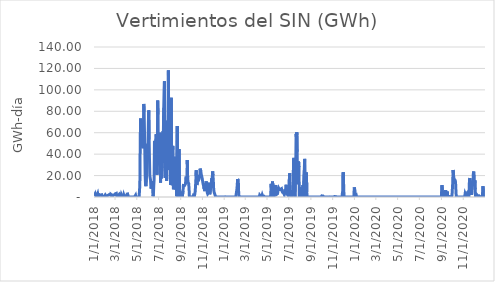
| Category | Vertimientos del SIN (GWh) |
|---|---|
| 1/1/18 | 1.13 |
| 1/2/18 | 1.378 |
| 1/3/18 | 1.344 |
| 1/4/18 | 3.189 |
| 1/5/18 | 3.084 |
| 1/6/18 | 1.109 |
| 1/7/18 | 1.927 |
| 1/8/18 | 1.603 |
| 1/9/18 | 1.216 |
| 1/10/18 | 0.999 |
| 1/11/18 | 3.016 |
| 1/12/18 | 1.271 |
| 1/13/18 | 1.168 |
| 1/14/18 | 2.095 |
| 1/15/18 | 0.832 |
| 1/16/18 | 2.172 |
| 1/17/18 | 2.599 |
| 1/18/18 | 1.788 |
| 1/19/18 | 1.779 |
| 1/20/18 | 1.538 |
| 1/21/18 | 0.948 |
| 1/22/18 | 2.077 |
| 1/23/18 | 0.926 |
| 1/24/18 | 0.16 |
| 1/25/18 | 0.067 |
| 1/26/18 | 0.034 |
| 1/27/18 | 0.506 |
| 1/28/18 | 0.187 |
| 1/29/18 | 0.585 |
| 1/30/18 | 1.235 |
| 1/31/18 | 1.028 |
| 2/1/18 | 1.982 |
| 2/2/18 | 1.625 |
| 2/3/18 | 0.869 |
| 2/4/18 | 0.114 |
| 2/5/18 | 0.027 |
| 2/6/18 | 1.088 |
| 2/7/18 | 1.088 |
| 2/8/18 | 1.008 |
| 2/9/18 | 1.652 |
| 2/10/18 | 1.34 |
| 2/11/18 | 1.743 |
| 2/12/18 | 2.206 |
| 2/13/18 | 2.71 |
| 2/14/18 | 1.597 |
| 2/15/18 | 1.786 |
| 2/16/18 | 2.73 |
| 2/17/18 | 2.939 |
| 2/18/18 | 2.361 |
| 2/19/18 | 1.885 |
| 2/20/18 | 1.237 |
| 2/21/18 | 1.271 |
| 2/22/18 | 0.869 |
| 2/23/18 | 0.67 |
| 2/24/18 | 1.959 |
| 2/25/18 | 2.119 |
| 2/26/18 | 2.29 |
| 2/27/18 | 2.001 |
| 2/28/18 | 2.127 |
| 3/1/18 | 2.964 |
| 3/2/18 | 2.808 |
| 3/3/18 | 3.043 |
| 3/4/18 | 3.418 |
| 3/5/18 | 1.757 |
| 3/6/18 | 0.362 |
| 3/7/18 | 0.404 |
| 3/8/18 | 1.287 |
| 3/9/18 | 1.099 |
| 3/10/18 | 0.787 |
| 3/11/18 | 1.512 |
| 3/12/18 | 2.406 |
| 3/13/18 | 1.493 |
| 3/14/18 | 0.835 |
| 3/15/18 | 0.569 |
| 3/16/18 | 0.784 |
| 3/17/18 | 0.842 |
| 3/18/18 | 2.352 |
| 3/19/18 | 2.52 |
| 3/20/18 | 0.835 |
| 3/21/18 | 0.893 |
| 3/22/18 | 1.529 |
| 3/23/18 | 1.485 |
| 3/24/18 | 0.261 |
| 3/25/18 | 1.938 |
| 3/26/18 | 1.082 |
| 3/27/18 | 0.031 |
| 3/28/18 | 0.208 |
| 3/29/18 | 1.074 |
| 3/30/18 | 2.277 |
| 3/31/18 | 0.946 |
| 4/1/18 | 1.582 |
| 4/2/18 | 0.538 |
| 4/3/18 | 0 |
| 4/4/18 | 3.951 |
| 4/5/18 | 3.057 |
| 4/6/18 | 0 |
| 4/7/18 | 0 |
| 4/8/18 | 0 |
| 4/9/18 | 0 |
| 4/10/18 | 0 |
| 4/11/18 | 0 |
| 4/12/18 | 0 |
| 4/13/18 | 0 |
| 4/14/18 | 0 |
| 4/15/18 | 0 |
| 4/16/18 | 0 |
| 4/17/18 | 0 |
| 4/18/18 | 0 |
| 4/19/18 | 0 |
| 4/20/18 | 0 |
| 4/21/18 | 0 |
| 4/22/18 | 0 |
| 4/23/18 | 0 |
| 4/24/18 | 0 |
| 4/25/18 | 0 |
| 4/26/18 | 0 |
| 4/27/18 | 1.664 |
| 4/28/18 | 0.016 |
| 4/29/18 | 0 |
| 4/30/18 | 0 |
| 5/1/18 | 0 |
| 5/2/18 | 0.013 |
| 5/3/18 | 0 |
| 5/4/18 | 0 |
| 5/5/18 | 0 |
| 5/6/18 | 0 |
| 5/7/18 | 0 |
| 5/8/18 | 0 |
| 5/9/18 | 11.345 |
| 5/10/18 | 47.714 |
| 5/11/18 | 73.344 |
| 5/12/18 | 55.013 |
| 5/13/18 | 47.196 |
| 5/14/18 | 46.907 |
| 5/15/18 | 54.562 |
| 5/16/18 | 66.563 |
| 5/17/18 | 54.569 |
| 5/18/18 | 45.534 |
| 5/19/18 | 65.001 |
| 5/20/18 | 86.863 |
| 5/21/18 | 79.586 |
| 5/22/18 | 62.147 |
| 5/23/18 | 42.409 |
| 5/24/18 | 19.441 |
| 5/25/18 | 11.247 |
| 5/26/18 | 10.089 |
| 5/27/18 | 10.82 |
| 5/28/18 | 22.261 |
| 5/29/18 | 37.833 |
| 5/30/18 | 48.49 |
| 5/31/18 | 48.189 |
| 6/1/18 | 50.542 |
| 6/2/18 | 70.384 |
| 6/3/18 | 80.857 |
| 6/4/18 | 53.636 |
| 6/5/18 | 36.119 |
| 6/6/18 | 19.766 |
| 6/7/18 | 20.371 |
| 6/8/18 | 15.695 |
| 6/9/18 | 9.11 |
| 6/10/18 | 7.912 |
| 6/11/18 | 8.103 |
| 6/12/18 | 14.917 |
| 6/13/18 | 12.398 |
| 6/14/18 | 6.752 |
| 6/15/18 | 0.613 |
| 6/16/18 | 1.887 |
| 6/17/18 | 10.53 |
| 6/18/18 | 16.359 |
| 6/19/18 | 52.508 |
| 6/20/18 | 51.498 |
| 6/21/18 | 32.649 |
| 6/22/18 | 47.881 |
| 6/23/18 | 46.274 |
| 6/24/18 | 58.596 |
| 6/25/18 | 58.2 |
| 6/26/18 | 20.866 |
| 6/27/18 | 37.448 |
| 6/28/18 | 90.042 |
| 6/29/18 | 76.919 |
| 6/30/18 | 32.426 |
| 7/1/18 | 37.192 |
| 7/2/18 | 30.074 |
| 7/3/18 | 32.17 |
| 7/4/18 | 29.863 |
| 7/5/18 | 59.894 |
| 7/6/18 | 13.638 |
| 7/7/18 | 58.239 |
| 7/8/18 | 17.409 |
| 7/9/18 | 23.058 |
| 7/10/18 | 38.707 |
| 7/11/18 | 44.361 |
| 7/12/18 | 31.779 |
| 7/13/18 | 61.428 |
| 7/14/18 | 60.366 |
| 7/15/18 | 83.356 |
| 7/16/18 | 99.757 |
| 7/17/18 | 107.99 |
| 7/18/18 | 27.137 |
| 7/19/18 | 17.843 |
| 7/20/18 | 36.11 |
| 7/21/18 | 48.781 |
| 7/22/18 | 36.204 |
| 7/23/18 | 15.194 |
| 7/24/18 | 71.061 |
| 7/25/18 | 25.46 |
| 7/26/18 | 26.656 |
| 7/27/18 | 56.915 |
| 7/28/18 | 118.183 |
| 7/29/18 | 54.704 |
| 7/30/18 | 32.196 |
| 7/31/18 | 29.416 |
| 8/1/18 | 31.198 |
| 8/2/18 | 25.109 |
| 8/3/18 | 11.156 |
| 8/4/18 | 12.38 |
| 8/5/18 | 92.545 |
| 8/6/18 | 22.423 |
| 8/7/18 | 24.823 |
| 8/8/18 | 21.728 |
| 8/9/18 | 47.682 |
| 8/10/18 | 43.963 |
| 8/11/18 | 7.137 |
| 8/12/18 | 11.088 |
| 8/13/18 | 21.677 |
| 8/14/18 | 37.651 |
| 8/15/18 | 37.523 |
| 8/16/18 | 7.38 |
| 8/17/18 | 19.464 |
| 8/18/18 | 31.805 |
| 8/19/18 | 23.89 |
| 8/20/18 | 0.691 |
| 8/21/18 | 0 |
| 8/22/18 | 66.348 |
| 8/23/18 | 14.642 |
| 8/24/18 | 0 |
| 8/25/18 | 3.802 |
| 8/26/18 | 4.183 |
| 8/27/18 | 44.679 |
| 8/28/18 | 7.275 |
| 8/29/18 | 0 |
| 8/30/18 | 0.249 |
| 8/31/18 | 1.905 |
| 9/1/18 | 0.875 |
| 9/2/18 | 1.799 |
| 9/3/18 | 2.384 |
| 9/4/18 | 3.048 |
| 9/5/18 | 0.126 |
| 9/6/18 | 0.985 |
| 9/7/18 | 5.502 |
| 9/8/18 | 10.743 |
| 9/9/18 | 10.808 |
| 9/10/18 | 10.234 |
| 9/11/18 | 10.569 |
| 9/12/18 | 11.312 |
| 9/13/18 | 10.351 |
| 9/14/18 | 12.313 |
| 9/15/18 | 17.996 |
| 9/16/18 | 17.278 |
| 9/17/18 | 17.117 |
| 9/18/18 | 18.101 |
| 9/19/18 | 34.513 |
| 9/20/18 | 18.905 |
| 9/21/18 | 13.642 |
| 9/22/18 | 13.021 |
| 9/23/18 | 12.629 |
| 9/24/18 | 6.981 |
| 9/25/18 | 0 |
| 9/26/18 | 0 |
| 9/27/18 | 0 |
| 9/28/18 | 0 |
| 9/29/18 | 0 |
| 9/30/18 | 0 |
| 10/1/18 | 0 |
| 10/2/18 | 0 |
| 10/3/18 | 0 |
| 10/4/18 | 0 |
| 10/5/18 | 0.251 |
| 10/6/18 | 1.532 |
| 10/7/18 | 0.853 |
| 10/8/18 | 0.858 |
| 10/9/18 | 0.777 |
| 10/10/18 | 0.538 |
| 10/11/18 | 4.81 |
| 10/12/18 | 9.451 |
| 10/13/18 | 15.579 |
| 10/14/18 | 24.971 |
| 10/15/18 | 13.981 |
| 10/16/18 | 11.19 |
| 10/17/18 | 11.75 |
| 10/18/18 | 11.306 |
| 10/19/18 | 18.306 |
| 10/20/18 | 17.913 |
| 10/21/18 | 17.585 |
| 10/22/18 | 17.012 |
| 10/23/18 | 17.415 |
| 10/24/18 | 19.076 |
| 10/25/18 | 26.485 |
| 10/26/18 | 25.879 |
| 10/27/18 | 23.935 |
| 10/28/18 | 21.285 |
| 10/29/18 | 20.487 |
| 10/30/18 | 18.573 |
| 10/31/18 | 16.778 |
| 11/1/18 | 16.037 |
| 11/2/18 | 12.679 |
| 11/3/18 | 13.084 |
| 11/4/18 | 9.648 |
| 11/5/18 | 7.453 |
| 11/6/18 | 9.239 |
| 11/7/18 | 5.482 |
| 11/8/18 | 5.76 |
| 11/9/18 | 5.344 |
| 11/10/18 | 12.852 |
| 11/11/18 | 14.563 |
| 11/12/18 | 14.301 |
| 11/13/18 | 10.734 |
| 11/14/18 | 3.94 |
| 11/15/18 | 2.961 |
| 11/16/18 | 2.59 |
| 11/17/18 | 4.092 |
| 11/18/18 | 12.015 |
| 11/19/18 | 13.322 |
| 11/20/18 | 9.498 |
| 11/21/18 | 2.529 |
| 11/22/18 | 3.05 |
| 11/23/18 | 7.206 |
| 11/24/18 | 7.331 |
| 11/25/18 | 10.421 |
| 11/26/18 | 17.328 |
| 11/27/18 | 11.017 |
| 11/28/18 | 17.397 |
| 11/29/18 | 23.912 |
| 11/30/18 | 20.293 |
| 12/1/18 | 15.094 |
| 12/2/18 | 6.906 |
| 12/3/18 | 4.914 |
| 12/4/18 | 3.543 |
| 12/5/18 | 2.782 |
| 12/6/18 | 1.768 |
| 12/7/18 | 0.645 |
| 12/8/18 | 0.332 |
| 12/9/18 | 0.204 |
| 12/10/18 | 0.031 |
| 12/11/18 | 0 |
| 12/12/18 | 0 |
| 12/13/18 | 0 |
| 12/14/18 | 0 |
| 12/15/18 | 0 |
| 12/16/18 | 0 |
| 12/17/18 | 0 |
| 12/18/18 | 0 |
| 12/19/18 | 0 |
| 12/20/18 | 0 |
| 12/21/18 | 0 |
| 12/22/18 | 0 |
| 12/23/18 | 0 |
| 12/24/18 | 0 |
| 12/25/18 | 0 |
| 12/26/18 | 0 |
| 12/27/18 | 0 |
| 12/28/18 | 0 |
| 12/29/18 | 0 |
| 12/30/18 | 0 |
| 12/31/18 | 0 |
| 1/1/19 | 0 |
| 1/2/19 | 0 |
| 1/3/19 | 0.163 |
| 1/4/19 | 0 |
| 1/5/19 | 0 |
| 1/6/19 | 0 |
| 1/7/19 | 0 |
| 1/8/19 | 0 |
| 1/9/19 | 0 |
| 1/10/19 | 0 |
| 1/11/19 | 0 |
| 1/12/19 | 0 |
| 1/13/19 | 0 |
| 1/14/19 | 0 |
| 1/15/19 | 0 |
| 1/16/19 | 0 |
| 1/17/19 | 0 |
| 1/18/19 | 0 |
| 1/19/19 | 0 |
| 1/20/19 | 0 |
| 1/21/19 | 0 |
| 1/22/19 | 0 |
| 1/23/19 | 0 |
| 1/24/19 | 0 |
| 1/25/19 | 0 |
| 1/26/19 | 0 |
| 1/27/19 | 0 |
| 1/28/19 | 0 |
| 1/29/19 | 0 |
| 1/30/19 | 0 |
| 1/31/19 | 0 |
| 2/1/19 | 0 |
| 2/2/19 | 0 |
| 2/3/19 | 0 |
| 2/4/19 | 0 |
| 2/5/19 | 7.145 |
| 2/6/19 | 10.8 |
| 2/7/19 | 16.76 |
| 2/8/19 | 17.586 |
| 2/9/19 | 15.396 |
| 2/10/19 | 4.379 |
| 2/11/19 | 0 |
| 2/12/19 | 0 |
| 2/13/19 | 0 |
| 2/14/19 | 0 |
| 2/15/19 | 0 |
| 2/16/19 | 0 |
| 2/17/19 | 0 |
| 2/18/19 | 0 |
| 2/19/19 | 0 |
| 2/20/19 | 0 |
| 2/21/19 | 0 |
| 2/22/19 | 0 |
| 2/23/19 | 0 |
| 2/24/19 | 0 |
| 2/25/19 | 0 |
| 2/26/19 | 0 |
| 2/27/19 | 0 |
| 2/28/19 | 0 |
| 3/1/19 | 0 |
| 3/2/19 | 0 |
| 3/3/19 | 0 |
| 3/4/19 | 0 |
| 3/5/19 | 0 |
| 3/6/19 | 0 |
| 3/7/19 | 0 |
| 3/8/19 | 0 |
| 3/9/19 | 0 |
| 3/10/19 | 0 |
| 3/11/19 | 0 |
| 3/12/19 | 0 |
| 3/13/19 | 0 |
| 3/14/19 | 0 |
| 3/15/19 | 0 |
| 3/16/19 | 0 |
| 3/17/19 | 0 |
| 3/18/19 | 0 |
| 3/19/19 | 0 |
| 3/20/19 | 0 |
| 3/21/19 | 0 |
| 3/22/19 | 0 |
| 3/23/19 | 0 |
| 3/24/19 | 0 |
| 3/25/19 | 0 |
| 3/26/19 | 0 |
| 3/27/19 | 0 |
| 3/28/19 | 0 |
| 3/29/19 | 0 |
| 3/30/19 | 0 |
| 3/31/19 | 0 |
| 4/1/19 | 0 |
| 4/2/19 | 0 |
| 4/3/19 | 0 |
| 4/4/19 | 0 |
| 4/5/19 | 0 |
| 4/6/19 | 0 |
| 4/7/19 | 0 |
| 4/8/19 | 0 |
| 4/9/19 | 0.447 |
| 4/10/19 | 1.83 |
| 4/11/19 | 1.23 |
| 4/12/19 | 0.955 |
| 4/13/19 | 0.595 |
| 4/14/19 | 0.479 |
| 4/15/19 | 0.897 |
| 4/16/19 | 0.868 |
| 4/17/19 | 1.957 |
| 4/18/19 | 1.005 |
| 4/19/19 | 0.007 |
| 4/20/19 | 0 |
| 4/21/19 | 0.365 |
| 4/22/19 | 0.7 |
| 4/23/19 | 0.006 |
| 4/24/19 | 0 |
| 4/25/19 | 0 |
| 4/26/19 | 0 |
| 4/27/19 | 0 |
| 4/28/19 | 0 |
| 4/29/19 | 0 |
| 4/30/19 | 0 |
| 5/1/19 | 0 |
| 5/2/19 | 0 |
| 5/3/19 | 0 |
| 5/4/19 | 0 |
| 5/5/19 | 0 |
| 5/6/19 | 0 |
| 5/7/19 | 0 |
| 5/8/19 | 0 |
| 5/9/19 | 0 |
| 5/10/19 | 0 |
| 5/11/19 | 2.725 |
| 5/12/19 | 12.293 |
| 5/13/19 | 7.363 |
| 5/14/19 | 2.854 |
| 5/15/19 | 8.975 |
| 5/16/19 | 14.529 |
| 5/17/19 | 7.783 |
| 5/18/19 | 0.176 |
| 5/19/19 | 0.997 |
| 5/20/19 | 1.425 |
| 5/21/19 | 2.678 |
| 5/22/19 | 5.218 |
| 5/23/19 | 9.489 |
| 5/24/19 | 10.335 |
| 5/25/19 | 11.151 |
| 5/26/19 | 5.161 |
| 5/27/19 | 2.374 |
| 5/28/19 | 2.344 |
| 5/29/19 | 2.191 |
| 5/30/19 | 3.13 |
| 5/31/19 | 5.497 |
| 6/1/19 | 7.291 |
| 6/2/19 | 8.35 |
| 6/3/19 | 8.031 |
| 6/4/19 | 6.985 |
| 6/5/19 | 6.883 |
| 6/6/19 | 6.336 |
| 6/7/19 | 7.196 |
| 6/8/19 | 7.634 |
| 6/9/19 | 6.473 |
| 6/10/19 | 7.791 |
| 6/11/19 | 5.892 |
| 6/12/19 | 5.33 |
| 6/13/19 | 4.375 |
| 6/14/19 | 4.093 |
| 6/15/19 | 5.092 |
| 6/16/19 | 3.814 |
| 6/17/19 | 2.993 |
| 6/18/19 | 2.18 |
| 6/19/19 | 3.326 |
| 6/20/19 | 7.079 |
| 6/21/19 | 4.395 |
| 6/22/19 | 6.414 |
| 6/23/19 | 11.408 |
| 6/24/19 | 6.563 |
| 6/25/19 | 3.293 |
| 6/26/19 | 6.261 |
| 6/27/19 | 2.105 |
| 6/28/19 | 2.776 |
| 6/29/19 | 1.078 |
| 6/30/19 | 2.316 |
| 7/1/19 | 0.827 |
| 7/2/19 | 15.979 |
| 7/3/19 | 22.134 |
| 7/4/19 | 2.358 |
| 7/5/19 | 2.754 |
| 7/6/19 | 6.345 |
| 7/7/19 | 0.37 |
| 7/8/19 | 0.266 |
| 7/9/19 | 0.586 |
| 7/10/19 | 1.376 |
| 7/11/19 | 1.52 |
| 7/12/19 | 3.101 |
| 7/13/19 | 2.977 |
| 7/14/19 | 35.251 |
| 7/15/19 | 36.519 |
| 7/16/19 | 10.056 |
| 7/17/19 | 0.937 |
| 7/18/19 | 0.001 |
| 7/19/19 | 17.537 |
| 7/20/19 | 27.281 |
| 7/21/19 | 59.003 |
| 7/22/19 | 55.611 |
| 7/23/19 | 60.38 |
| 7/24/19 | 42.307 |
| 7/25/19 | 11.976 |
| 7/26/19 | 11.988 |
| 7/27/19 | 20.948 |
| 7/28/19 | 33.18 |
| 7/29/19 | 27.829 |
| 7/30/19 | 0 |
| 7/31/19 | 0 |
| 8/1/19 | 0 |
| 8/2/19 | 0 |
| 8/3/19 | 5.049 |
| 8/4/19 | 4.851 |
| 8/5/19 | 9.012 |
| 8/6/19 | 0 |
| 8/7/19 | 0 |
| 8/8/19 | 7.072 |
| 8/9/19 | 11.057 |
| 8/10/19 | 0 |
| 8/11/19 | 0 |
| 8/12/19 | 0.421 |
| 8/13/19 | 25.004 |
| 8/14/19 | 35.596 |
| 8/15/19 | 4.338 |
| 8/16/19 | 0 |
| 8/17/19 | 0 |
| 8/18/19 | 0 |
| 8/19/19 | 22.773 |
| 8/20/19 | 4.546 |
| 8/21/19 | 0 |
| 8/22/19 | 0 |
| 8/23/19 | 0 |
| 8/24/19 | 0 |
| 8/25/19 | 0 |
| 8/26/19 | 0 |
| 8/27/19 | 0 |
| 8/28/19 | 0 |
| 8/29/19 | 0 |
| 8/30/19 | 0 |
| 8/31/19 | 0 |
| 9/1/19 | 0 |
| 9/2/19 | 0 |
| 9/3/19 | 0 |
| 9/4/19 | 0 |
| 9/5/19 | 0 |
| 9/6/19 | 0 |
| 9/7/19 | 0 |
| 9/8/19 | 0 |
| 9/9/19 | 0 |
| 9/10/19 | 0 |
| 9/11/19 | 0 |
| 9/12/19 | 0 |
| 9/13/19 | 0 |
| 9/14/19 | 0 |
| 9/15/19 | 0 |
| 9/16/19 | 0 |
| 9/17/19 | 0 |
| 9/18/19 | 0 |
| 9/19/19 | 0 |
| 9/20/19 | 0.001 |
| 9/21/19 | 0 |
| 9/22/19 | 0 |
| 9/23/19 | 0 |
| 9/24/19 | 0 |
| 9/25/19 | 0 |
| 9/26/19 | 0 |
| 9/27/19 | 0 |
| 9/28/19 | 0 |
| 9/29/19 | 0 |
| 9/30/19 | 0.011 |
| 10/1/19 | 1.052 |
| 10/2/19 | 1.057 |
| 10/3/19 | 1.006 |
| 10/4/19 | 1 |
| 10/5/19 | 0.935 |
| 10/6/19 | 0.751 |
| 10/7/19 | 0 |
| 10/8/19 | 0.292 |
| 10/9/19 | 0 |
| 10/10/19 | 0 |
| 10/11/19 | 0 |
| 10/12/19 | 0 |
| 10/13/19 | 0.046 |
| 10/14/19 | 0.161 |
| 10/15/19 | 0.117 |
| 10/16/19 | 0.003 |
| 10/17/19 | 0 |
| 10/18/19 | 0 |
| 10/19/19 | 0 |
| 10/20/19 | 0.001 |
| 10/21/19 | 0.002 |
| 10/22/19 | 0.121 |
| 10/23/19 | 0.046 |
| 10/24/19 | 0.074 |
| 10/25/19 | 0.066 |
| 10/26/19 | 0.014 |
| 10/27/19 | 0 |
| 10/28/19 | 0 |
| 10/29/19 | 0 |
| 10/30/19 | 0 |
| 10/31/19 | 0.029 |
| 11/1/19 | 0 |
| 11/2/19 | 0.003 |
| 11/3/19 | 0.086 |
| 11/4/19 | 0.32 |
| 11/5/19 | 0.496 |
| 11/6/19 | 0.498 |
| 11/7/19 | 0.46 |
| 11/8/19 | 0.418 |
| 11/9/19 | 0.24 |
| 11/10/19 | 0.057 |
| 11/11/19 | 0.03 |
| 11/12/19 | 0.117 |
| 11/13/19 | 0.164 |
| 11/14/19 | 0.068 |
| 11/15/19 | 0.004 |
| 11/16/19 | 0 |
| 11/17/19 | 0 |
| 11/18/19 | 0 |
| 11/19/19 | 0 |
| 11/20/19 | 0 |
| 11/21/19 | 0 |
| 11/22/19 | 0 |
| 11/23/19 | 0 |
| 11/24/19 | 0 |
| 11/25/19 | 0 |
| 11/26/19 | 0 |
| 11/27/19 | 0 |
| 11/28/19 | 4.866 |
| 11/29/19 | 0 |
| 11/30/19 | 23.009 |
| 12/1/19 | 14.086 |
| 12/2/19 | 3.605 |
| 12/3/19 | 0 |
| 12/4/19 | 0 |
| 12/5/19 | 0 |
| 12/6/19 | 0 |
| 12/7/19 | 0 |
| 12/8/19 | 0 |
| 12/9/19 | 0 |
| 12/10/19 | 0 |
| 12/11/19 | 0 |
| 12/12/19 | 0 |
| 12/13/19 | 0 |
| 12/14/19 | 0 |
| 12/15/19 | 0 |
| 12/16/19 | 0 |
| 12/17/19 | 0.315 |
| 12/18/19 | 0 |
| 12/19/19 | 0 |
| 12/20/19 | 0 |
| 12/21/19 | 0 |
| 12/22/19 | 0 |
| 12/23/19 | 0 |
| 12/24/19 | 0 |
| 12/25/19 | 0 |
| 12/26/19 | 0 |
| 12/27/19 | 0 |
| 12/28/19 | 0 |
| 12/29/19 | 0 |
| 12/30/19 | 0 |
| 12/31/19 | 8.97 |
| 1/1/20 | 7.592 |
| 1/2/20 | 5.743 |
| 1/3/20 | 0 |
| 1/4/20 | 0 |
| 1/5/20 | 0.143 |
| 1/6/20 | 1.273 |
| 1/7/20 | 0 |
| 1/8/20 | 0 |
| 1/9/20 | 0 |
| 1/10/20 | 0 |
| 1/11/20 | 0 |
| 1/12/20 | 0 |
| 1/13/20 | 0 |
| 1/14/20 | 0 |
| 1/15/20 | 0 |
| 1/16/20 | 0 |
| 1/17/20 | 0 |
| 1/18/20 | 0 |
| 1/19/20 | 0 |
| 1/20/20 | 0 |
| 1/21/20 | 0 |
| 1/22/20 | 0 |
| 1/23/20 | 0 |
| 1/24/20 | 0 |
| 1/25/20 | 0 |
| 1/26/20 | 0 |
| 1/27/20 | 0 |
| 1/28/20 | 0 |
| 1/29/20 | 0 |
| 1/30/20 | 0 |
| 1/31/20 | 0 |
| 2/1/20 | 0 |
| 2/2/20 | 0 |
| 2/3/20 | 0 |
| 2/4/20 | 0 |
| 2/5/20 | 0 |
| 2/6/20 | 0 |
| 2/7/20 | 0 |
| 2/8/20 | 0 |
| 2/9/20 | 0 |
| 2/10/20 | 0 |
| 2/11/20 | 0 |
| 2/12/20 | 0 |
| 2/13/20 | 0 |
| 2/14/20 | 0 |
| 2/15/20 | 0 |
| 2/16/20 | 0 |
| 2/17/20 | 0 |
| 2/18/20 | 0 |
| 2/19/20 | 0 |
| 2/20/20 | 0 |
| 2/21/20 | 0 |
| 2/22/20 | 0 |
| 2/23/20 | 0 |
| 2/24/20 | 0 |
| 2/25/20 | 0 |
| 2/26/20 | 0 |
| 2/27/20 | 0 |
| 2/28/20 | 0 |
| 2/29/20 | 0 |
| 3/1/20 | 0 |
| 3/2/20 | 0 |
| 3/3/20 | 0 |
| 3/4/20 | 0 |
| 3/5/20 | 0 |
| 3/6/20 | 0 |
| 3/7/20 | 0 |
| 3/8/20 | 0 |
| 3/9/20 | 0 |
| 3/10/20 | 0 |
| 3/11/20 | 0 |
| 3/12/20 | 0 |
| 3/13/20 | 0 |
| 3/14/20 | 0 |
| 3/15/20 | 0 |
| 3/16/20 | 0 |
| 3/17/20 | 0 |
| 3/18/20 | 0 |
| 3/19/20 | 0 |
| 3/20/20 | 0 |
| 3/21/20 | 0 |
| 3/22/20 | 0 |
| 3/23/20 | 0 |
| 3/24/20 | 0 |
| 3/25/20 | 0 |
| 3/26/20 | 0 |
| 3/27/20 | 0 |
| 3/28/20 | 0 |
| 3/29/20 | 0 |
| 3/30/20 | 0 |
| 3/31/20 | 0 |
| 4/1/20 | 0 |
| 4/2/20 | 0 |
| 4/3/20 | 0 |
| 4/4/20 | 0 |
| 4/5/20 | 0 |
| 4/6/20 | 0 |
| 4/7/20 | 0 |
| 4/8/20 | 0 |
| 4/9/20 | 0 |
| 4/10/20 | 0 |
| 4/11/20 | 0 |
| 4/12/20 | 0 |
| 4/13/20 | 0 |
| 4/14/20 | 0 |
| 4/15/20 | 0 |
| 4/16/20 | 0 |
| 4/17/20 | 0 |
| 4/18/20 | 0 |
| 4/19/20 | 0 |
| 4/20/20 | 0 |
| 4/21/20 | 0 |
| 4/22/20 | 0 |
| 4/23/20 | 0 |
| 4/24/20 | 0 |
| 4/25/20 | 0 |
| 4/26/20 | 0 |
| 4/27/20 | 0 |
| 4/28/20 | 0 |
| 4/29/20 | 0 |
| 4/30/20 | 0 |
| 5/1/20 | 0 |
| 5/2/20 | 0 |
| 5/3/20 | 0 |
| 5/4/20 | 0 |
| 5/5/20 | 0 |
| 5/6/20 | 0 |
| 5/7/20 | 0 |
| 5/8/20 | 0 |
| 5/9/20 | 0 |
| 5/10/20 | 0 |
| 5/11/20 | 0 |
| 5/12/20 | 0 |
| 5/13/20 | 0 |
| 5/14/20 | 0 |
| 5/15/20 | 0 |
| 5/16/20 | 0 |
| 5/17/20 | 0 |
| 5/18/20 | 0 |
| 5/19/20 | 0 |
| 5/20/20 | 0 |
| 5/21/20 | 0 |
| 5/22/20 | 0 |
| 5/23/20 | 0 |
| 5/24/20 | 0 |
| 5/25/20 | 0 |
| 5/26/20 | 0 |
| 5/27/20 | 0 |
| 5/28/20 | 0 |
| 5/29/20 | 0 |
| 5/30/20 | 0 |
| 5/31/20 | 0 |
| 6/1/20 | 0 |
| 6/2/20 | 0 |
| 6/3/20 | 0 |
| 6/4/20 | 0 |
| 6/5/20 | 0 |
| 6/6/20 | 0 |
| 6/7/20 | 0 |
| 6/8/20 | 0 |
| 6/9/20 | 0 |
| 6/10/20 | 0 |
| 6/11/20 | 0 |
| 6/12/20 | 0 |
| 6/13/20 | 0 |
| 6/14/20 | 0 |
| 6/15/20 | 0 |
| 6/16/20 | 0 |
| 6/17/20 | 0 |
| 6/18/20 | 0 |
| 6/19/20 | 0 |
| 6/20/20 | 0 |
| 6/21/20 | 0 |
| 6/22/20 | 0 |
| 6/23/20 | 0 |
| 6/24/20 | 0 |
| 6/25/20 | 0 |
| 6/26/20 | 0 |
| 6/27/20 | 0 |
| 6/28/20 | 0 |
| 6/29/20 | 0 |
| 6/30/20 | 0 |
| 7/1/20 | 0 |
| 7/2/20 | 0 |
| 7/3/20 | 0 |
| 7/4/20 | 0 |
| 7/5/20 | 0 |
| 7/6/20 | 0 |
| 7/7/20 | 0 |
| 7/8/20 | 0 |
| 7/9/20 | 0 |
| 7/10/20 | 0 |
| 7/11/20 | 0 |
| 7/12/20 | 0 |
| 7/13/20 | 0 |
| 7/14/20 | 0 |
| 7/15/20 | 0.001 |
| 7/16/20 | 0 |
| 7/17/20 | 0 |
| 7/18/20 | 0 |
| 7/19/20 | 0 |
| 7/20/20 | 0 |
| 7/21/20 | 0 |
| 7/22/20 | 0 |
| 7/23/20 | 0 |
| 7/24/20 | 0 |
| 7/25/20 | 0.002 |
| 7/26/20 | 0.002 |
| 7/27/20 | 0 |
| 7/28/20 | 0.049 |
| 7/29/20 | 0.016 |
| 7/30/20 | 0 |
| 7/31/20 | 0 |
| 8/1/20 | 0 |
| 8/2/20 | 0 |
| 8/3/20 | 0 |
| 8/4/20 | 0 |
| 8/5/20 | 0 |
| 8/6/20 | 0 |
| 8/7/20 | 0 |
| 8/8/20 | 0 |
| 8/9/20 | 0 |
| 8/10/20 | 0 |
| 8/11/20 | 0 |
| 8/12/20 | 0 |
| 8/13/20 | 0 |
| 8/14/20 | 0 |
| 8/15/20 | 0 |
| 8/16/20 | 0 |
| 8/17/20 | 0 |
| 8/18/20 | 0 |
| 8/19/20 | 0 |
| 8/20/20 | 0 |
| 8/21/20 | 0 |
| 8/22/20 | 0 |
| 8/23/20 | 0 |
| 8/24/20 | 0 |
| 8/25/20 | 0 |
| 8/26/20 | 0 |
| 8/27/20 | 0 |
| 8/28/20 | 0 |
| 8/29/20 | 0 |
| 8/30/20 | 0 |
| 8/31/20 | 0 |
| 9/1/20 | 0.763 |
| 9/2/20 | 11.118 |
| 9/3/20 | 4.743 |
| 9/4/20 | 0 |
| 9/5/20 | 0.887 |
| 9/6/20 | 2.284 |
| 9/7/20 | 0 |
| 9/8/20 | 5.655 |
| 9/9/20 | 2.612 |
| 9/10/20 | 0 |
| 9/11/20 | 0 |
| 9/12/20 | 6.491 |
| 9/13/20 | 3.847 |
| 9/14/20 | 0 |
| 9/15/20 | 0 |
| 9/16/20 | 3.38 |
| 9/17/20 | 5.15 |
| 9/18/20 | 0.236 |
| 9/19/20 | 0.36 |
| 9/20/20 | 0.002 |
| 9/21/20 | 0 |
| 9/22/20 | 0 |
| 9/23/20 | 0 |
| 9/24/20 | 0.423 |
| 9/25/20 | 1.18 |
| 9/26/20 | 0.235 |
| 9/27/20 | 0.043 |
| 9/28/20 | 0 |
| 9/29/20 | 0.102 |
| 9/30/20 | 1.237 |
| 10/1/20 | 1.658 |
| 10/2/20 | 13.022 |
| 10/3/20 | 25.221 |
| 10/4/20 | 22.375 |
| 10/5/20 | 18.021 |
| 10/6/20 | 16.768 |
| 10/7/20 | 16.02 |
| 10/8/20 | 17.325 |
| 10/9/20 | 15.506 |
| 10/10/20 | 13.337 |
| 10/11/20 | 5.994 |
| 10/12/20 | 0 |
| 10/13/20 | 0 |
| 10/14/20 | 0.202 |
| 10/15/20 | 0.126 |
| 10/16/20 | 0.028 |
| 10/17/20 | 0 |
| 10/18/20 | 0 |
| 10/19/20 | 0 |
| 10/20/20 | 0 |
| 10/21/20 | 0 |
| 10/22/20 | 0 |
| 10/23/20 | 0 |
| 10/24/20 | 0 |
| 10/25/20 | 0 |
| 10/26/20 | 0 |
| 10/27/20 | 0 |
| 10/28/20 | 0 |
| 10/29/20 | 0 |
| 10/30/20 | 0 |
| 10/31/20 | 0 |
| 11/1/20 | 0 |
| 11/2/20 | 0 |
| 11/3/20 | 0 |
| 11/4/20 | 0.029 |
| 11/5/20 | 0.993 |
| 11/6/20 | 3.41 |
| 11/7/20 | 2.59 |
| 11/8/20 | 1.976 |
| 11/9/20 | 1.472 |
| 11/10/20 | 0.668 |
| 11/11/20 | 1.492 |
| 11/12/20 | 0.653 |
| 11/13/20 | 2.355 |
| 11/14/20 | 5.293 |
| 11/15/20 | 1.983 |
| 11/16/20 | 0.257 |
| 11/17/20 | 6.54 |
| 11/18/20 | 16.489 |
| 11/19/20 | 17.584 |
| 11/20/20 | 17.428 |
| 11/21/20 | 16.937 |
| 11/22/20 | 11.734 |
| 11/23/20 | 4.085 |
| 11/24/20 | 2.092 |
| 11/25/20 | 8.74 |
| 11/26/20 | 9.175 |
| 11/27/20 | 8.822 |
| 11/28/20 | 13.029 |
| 11/29/20 | 22.568 |
| 11/30/20 | 23.765 |
| 12/1/20 | 14.36 |
| 12/2/20 | 11.703 |
| 12/3/20 | 15.749 |
| 12/4/20 | 7.208 |
| 12/5/20 | 1.787 |
| 12/6/20 | 1.112 |
| 12/7/20 | 2.774 |
| 12/8/20 | 2.371 |
| 12/9/20 | 3.639 |
| 12/10/20 | 1.452 |
| 12/11/20 | 0.578 |
| 12/12/20 | 0.201 |
| 12/13/20 | 0.188 |
| 12/14/20 | 0.641 |
| 12/15/20 | 1.01 |
| 12/16/20 | 0.118 |
| 12/17/20 | 0.334 |
| 12/18/20 | 0.342 |
| 12/19/20 | 0.594 |
| 12/20/20 | 0.543 |
| 12/21/20 | 0.18 |
| 12/22/20 | 0.148 |
| 12/23/20 | 0.04 |
| 12/24/20 | 0.23 |
| 12/25/20 | 0.397 |
| 12/26/20 | 10.101 |
| 12/27/20 | 1.041 |
| 12/28/20 | 0 |
| 12/29/20 | 0 |
| 12/30/20 | 0 |
| 12/31/20 | 0 |